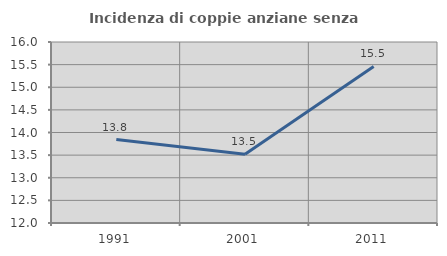
| Category | Incidenza di coppie anziane senza figli  |
|---|---|
| 1991.0 | 13.843 |
| 2001.0 | 13.521 |
| 2011.0 | 15.46 |